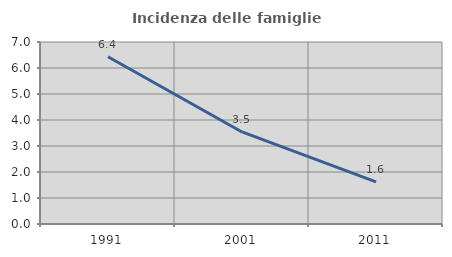
| Category | Incidenza delle famiglie numerose |
|---|---|
| 1991.0 | 6.435 |
| 2001.0 | 3.54 |
| 2011.0 | 1.617 |